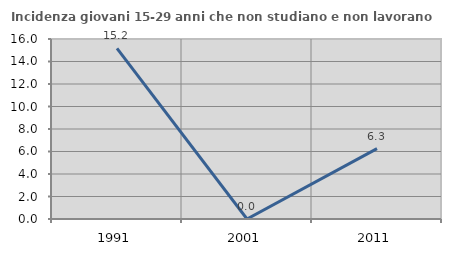
| Category | Incidenza giovani 15-29 anni che non studiano e non lavorano  |
|---|---|
| 1991.0 | 15.172 |
| 2001.0 | 0 |
| 2011.0 | 6.25 |